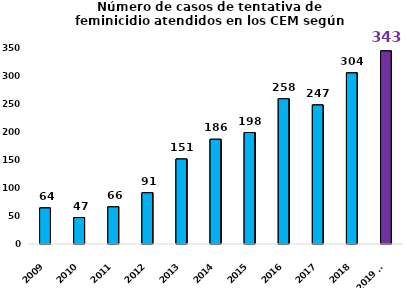
| Category | Tentativa de feminicidio |
|---|---|
| 2009 | 64 |
| 2010 | 47 |
| 2011 | 66 |
| 2012 | 91 |
| 2013 | 151 |
| 2014 | 186 |
| 2015 | 198 |
| 2016 | 258 |
| 2017 | 247 |
| 2018 | 304 |
| 2019 a/ | 343 |